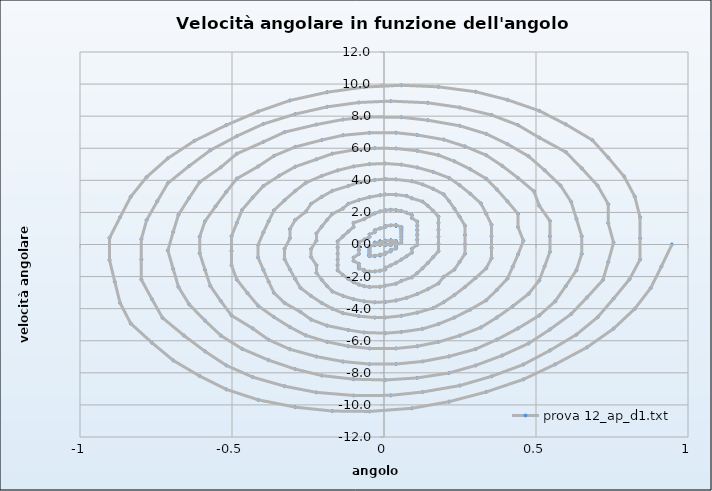
| Category | prova 12_ap_d1.txt |
|---|---|
| 0.9471016161102651 | 0 |
| 0.9121950310702651 | -1.382 |
| 0.8772884460302651 | -2.713 |
| 0.8249285684702651 | -4.007 |
| 0.7551153983912651 | -5.247 |
| 0.6678489357912651 | -6.41 |
| 0.5631291806712652 | -7.473 |
| 0.4584094255522651 | -8.409 |
| 0.3362363779122651 | -9.192 |
| 0.21406333027226512 | -9.8 |
| 0.09189028263296511 | -10.209 |
| -0.047736057526534884 | -10.406 |
| -0.16990910516573487 | -10.382 |
| -0.2920821528057349 | -10.138 |
| -0.4142552004457349 | -9.682 |
| -0.5189749555647349 | -9.029 |
| -0.6062414181647349 | -8.202 |
| -0.6935078807647349 | -7.224 |
| -0.7633210508447349 | -6.123 |
| -0.8331342209237349 | -4.923 |
| -0.8680408059637349 | -3.649 |
| -0.8854940984837348 | -2.322 |
| -0.9029473910037349 | -0.965 |
| -0.9029473910037349 | 0.406 |
| -0.8680408059637349 | 1.701 |
| -0.8331342209237349 | 2.974 |
| -0.7807743433637349 | 4.205 |
| -0.7109611732847348 | 5.374 |
| -0.6236947106847349 | 6.46 |
| -0.5189749555647349 | 7.438 |
| -0.4142552004457349 | 8.286 |
| -0.3095354453257349 | 8.977 |
| -0.1873623976857349 | 9.492 |
| -0.06518935004653488 | 9.812 |
| 0.05698369759306511 | 9.926 |
| 0.1791567452322651 | 9.829 |
| 0.30132979287226513 | 9.523 |
| 0.4060495479922651 | 9.02 |
| 0.5107693031112651 | 8.335 |
| 0.5980357657112652 | 7.49 |
| 0.6853022283112651 | 6.509 |
| 0.7376621058712651 | 5.416 |
| 0.7900219834302651 | 4.235 |
| 0.8249285684702651 | 2.989 |
| 0.8423818609902651 | 1.699 |
| 0.8423818609902651 | 0.384 |
| 0.8423818609902651 | -0.935 |
| 0.8074752759502651 | -2.172 |
| 0.7551153983912651 | -3.377 |
| 0.7027555208312651 | -4.532 |
| 0.6329423507512651 | -5.616 |
| 0.5456758881512651 | -6.607 |
| 0.4584094255522651 | -7.482 |
| 0.3536896704322651 | -8.219 |
| 0.24896991531226512 | -8.797 |
| 0.12679686767326512 | -9.196 |
| 0.02207711255316511 | -9.404 |
| -0.10009593508673488 | -9.412 |
| -0.2222689827257349 | -9.22 |
| -0.3269887378457349 | -8.834 |
| -0.4317084929657349 | -8.266 |
| -0.5189749555647349 | -7.535 |
| -0.5887881256447349 | -6.66 |
| -0.6586012957247349 | -5.665 |
| -0.7284144658047349 | -4.573 |
| -0.7633210508447349 | -3.406 |
| -0.7982276358837349 | -2.187 |
| -0.7982276358837349 | -0.934 |
| -0.7982276358837349 | 0.333 |
| -0.7807743433637349 | 1.524 |
| -0.7458677583247348 | 2.693 |
| -0.7109611732847348 | 3.821 |
| -0.6411480032047349 | 4.888 |
| -0.5713348331247349 | 5.874 |
| -0.4840683705247349 | 6.756 |
| -0.3968019079257349 | 7.515 |
| -0.2920821528057349 | 8.129 |
| -0.1873623976857349 | 8.579 |
| -0.08264264256643489 | 8.852 |
| 0.02207711255316511 | 8.939 |
| 0.14425016019326511 | 8.835 |
| 0.24896991531226512 | 8.544 |
| 0.3536896704322651 | 8.075 |
| 0.4409561330322651 | 7.442 |
| 0.5107693031112651 | 6.664 |
| 0.5980357657112652 | 5.76 |
| 0.6503956432712651 | 4.754 |
| 0.7027555208312651 | 3.666 |
| 0.7376621058712651 | 2.518 |
| 0.7376621058712651 | 1.33 |
| 0.7551153983912651 | 0.121 |
| 0.7376621058712651 | -1.089 |
| 0.7202088133512651 | -2.213 |
| 0.6678489357912651 | -3.302 |
| 0.6154890582312651 | -4.337 |
| 0.5456758881512651 | -5.298 |
| 0.4758627180712651 | -6.166 |
| 0.3885962554722651 | -6.92 |
| 0.30132979287226513 | -7.541 |
| 0.21406333027226512 | -8.011 |
| 0.10934357515326511 | -8.316 |
| 0.004623820033265111 | -8.446 |
| -0.10009593508673488 | -8.396 |
| -0.2048156902057349 | -8.168 |
| -0.2920821528057349 | -7.768 |
| -0.3793486154057349 | -7.209 |
| -0.4666150780047349 | -6.506 |
| -0.5364282480847349 | -5.679 |
| -0.5887881256447349 | -4.746 |
| -0.6411480032047349 | -3.729 |
| -0.6760545882447349 | -2.648 |
| -0.6935078807647349 | -1.523 |
| -0.7109611732847348 | -0.374 |
| -0.6935078807647349 | 0.782 |
| -0.6760545882447349 | 1.854 |
| -0.6411480032047349 | 2.897 |
| -0.6062414181647349 | 3.891 |
| -0.5364282480847349 | 4.818 |
| -0.4840683705247349 | 5.659 |
| -0.3968019079257349 | 6.394 |
| -0.3269887378457349 | 7.005 |
| -0.2222689827257349 | 7.476 |
| -0.1350025201267349 | 7.793 |
| -0.047736057526534884 | 7.947 |
| 0.05698369759306511 | 7.931 |
| 0.14425016019326511 | 7.747 |
| 0.24896991531226512 | 7.4 |
| 0.3362363779122651 | 6.899 |
| 0.4060495479922651 | 6.259 |
| 0.4758627180712651 | 5.497 |
| 0.5282225956312652 | 4.63 |
| 0.5805824731912651 | 3.679 |
| 0.6154890582312651 | 2.663 |
| 0.6329423507512651 | 1.601 |
| 0.6503956432712651 | 0.512 |
| 0.6503956432712651 | -0.586 |
| 0.6329423507512651 | -1.604 |
| 0.5980357657112652 | -2.595 |
| 0.5631291806712652 | -3.541 |
| 0.5107693031112651 | -4.424 |
| 0.4409561330322651 | -5.227 |
| 0.3711429629522651 | -5.931 |
| 0.30132979287226513 | -6.52 |
| 0.21406333027226512 | -6.977 |
| 0.12679686767326512 | -7.291 |
| 0.03953040507316511 | -7.451 |
| -0.047736057526534884 | -7.454 |
| -0.1350025201267349 | -7.297 |
| -0.2222689827257349 | -6.987 |
| -0.3095354453257349 | -6.53 |
| -0.3793486154057349 | -5.941 |
| -0.4317084929657349 | -5.234 |
| -0.5015216630447349 | -4.426 |
| -0.5364282480847349 | -3.535 |
| -0.5713348331247349 | -2.58 |
| -0.5887881256447349 | -1.579 |
| -0.6062414181647349 | -0.551 |
| -0.6062414181647349 | 0.487 |
| -0.5887881256447349 | 1.446 |
| -0.5538815406047349 | 2.381 |
| -0.5189749555647349 | 3.273 |
| -0.4840683705247349 | 4.106 |
| -0.4142552004457349 | 4.862 |
| -0.3618953228857349 | 5.526 |
| -0.2920821528057349 | 6.08 |
| -0.2048156902057349 | 6.512 |
| -0.1350025201267349 | 6.809 |
| -0.047736057526534884 | 6.963 |
| 0.03953040507316511 | 6.969 |
| 0.10934357515326511 | 6.826 |
| 0.19661003775226513 | 6.539 |
| 0.26642320783226514 | 6.116 |
| 0.3362363779122651 | 5.567 |
| 0.3885962554722651 | 4.906 |
| 0.4409561330322651 | 4.149 |
| 0.4933160105912651 | 3.314 |
| 0.5107693031112651 | 2.417 |
| 0.5456758881512651 | 1.475 |
| 0.5456758881512651 | 0.508 |
| 0.5456758881512651 | -0.469 |
| 0.5282225956312652 | -1.367 |
| 0.5107693031112651 | -2.241 |
| 0.4758627180712651 | -3.074 |
| 0.4235028405122651 | -3.85 |
| 0.3711429629522651 | -4.553 |
| 0.31878308539226513 | -5.168 |
| 0.24896991531226512 | -5.68 |
| 0.1791567452322651 | -6.076 |
| 0.10934357515326511 | -6.345 |
| 0.03953040507316511 | -6.481 |
| -0.047736057526534884 | -6.48 |
| -0.11754922760673489 | -6.34 |
| -0.1873623976857349 | -6.066 |
| -0.2571755677657349 | -5.665 |
| -0.3095354453257349 | -5.147 |
| -0.3618953228857349 | -4.526 |
| -0.4142552004457349 | -3.814 |
| -0.4491617854857349 | -3.03 |
| -0.4840683705247349 | -2.187 |
| -0.5015216630447349 | -1.304 |
| -0.5015216630447349 | -0.397 |
| -0.5015216630447349 | 0.517 |
| -0.4840683705247349 | 1.352 |
| -0.4666150780047349 | 2.162 |
| -0.4317084929657349 | 2.931 |
| -0.3968019079257349 | 3.645 |
| -0.3444420303657349 | 4.289 |
| -0.2920821528057349 | 4.848 |
| -0.2222689827257349 | 5.309 |
| -0.16990910516573487 | 5.661 |
| -0.10009593508673488 | 5.895 |
| -0.030282765006634887 | 6.004 |
| 0.03953040507316511 | 5.986 |
| 0.10934357515326511 | 5.84 |
| 0.1791567452322651 | 5.571 |
| 0.23151662279226512 | 5.185 |
| 0.28387650035226514 | 4.691 |
| 0.3362363779122651 | 4.103 |
| 0.3711429629522651 | 3.432 |
| 0.4060495479922651 | 2.694 |
| 0.4409561330322651 | 1.905 |
| 0.4409561330322651 | 1.079 |
| 0.4584094255522651 | 0.233 |
| 0.4409561330322651 | -0.617 |
| 0.4235028405122651 | -1.386 |
| 0.4060495479922651 | -2.129 |
| 0.3711429629522651 | -2.831 |
| 0.3362363779122651 | -3.478 |
| 0.28387650035226514 | -4.057 |
| 0.23151662279226512 | -4.554 |
| 0.1791567452322651 | -4.959 |
| 0.12679686767326512 | -5.261 |
| 0.05698369759306511 | -5.452 |
| 0.004623820033265111 | -5.528 |
| -0.06518935004653488 | -5.486 |
| -0.11754922760673489 | -5.328 |
| -0.1873623976857349 | -5.057 |
| -0.2397222752457349 | -4.68 |
| -0.2746288602857349 | -4.205 |
| -0.3269887378457349 | -3.645 |
| -0.3618953228857349 | -3.012 |
| -0.3793486154057349 | -2.319 |
| -0.3968019079257349 | -1.581 |
| -0.4142552004457349 | -0.812 |
| -0.4142552004457349 | -0.028 |
| -0.3968019079257349 | 0.757 |
| -0.3793486154057349 | 1.457 |
| -0.3618953228857349 | 2.129 |
| -0.3269887378457349 | 2.76 |
| -0.2920821528057349 | 3.336 |
| -0.2571755677657349 | 3.846 |
| -0.2048156902057349 | 4.277 |
| -0.15245581264573488 | 4.62 |
| -0.10009593508673488 | 4.866 |
| -0.047736057526534884 | 5.01 |
| 0.004623820033265111 | 5.048 |
| 0.05698369759306511 | 4.978 |
| 0.10934357515326511 | 4.802 |
| 0.1617034527122651 | 4.525 |
| 0.21406333027226512 | 4.153 |
| 0.24896991531226512 | 3.695 |
| 0.28387650035226514 | 3.161 |
| 0.31878308539226513 | 2.563 |
| 0.3362363779122651 | 1.914 |
| 0.3536896704322651 | 1.227 |
| 0.3536896704322651 | 0.516 |
| 0.3536896704322651 | -0.206 |
| 0.3536896704322651 | -0.853 |
| 0.3362363779122651 | -1.483 |
| 0.30132979287226513 | -2.084 |
| 0.26642320783226514 | -2.644 |
| 0.23151662279226512 | -3.151 |
| 0.19661003775226513 | -3.594 |
| 0.1617034527122651 | -3.963 |
| 0.10934357515326511 | -4.249 |
| 0.05698369759306511 | -4.446 |
| 0.004623820033265111 | -4.55 |
| -0.030282765006634887 | -4.556 |
| -0.08264264256643489 | -4.466 |
| -0.1350025201267349 | -4.28 |
| -0.16990910516573487 | -4.004 |
| -0.2048156902057349 | -3.644 |
| -0.2397222752457349 | -3.208 |
| -0.2746288602857349 | -2.707 |
| -0.2920821528057349 | -2.15 |
| -0.3095354453257349 | -1.549 |
| -0.3269887378457349 | -0.918 |
| -0.3269887378457349 | -0.268 |
| -0.3095354453257349 | 0.386 |
| -0.3095354453257349 | 0.964 |
| -0.2920821528057349 | 1.522 |
| -0.2571755677657349 | 2.049 |
| -0.2397222752457349 | 2.536 |
| -0.2048156902057349 | 2.97 |
| -0.16990910516573487 | 3.344 |
| -0.11754922760673489 | 3.648 |
| -0.08264264256643489 | 3.875 |
| -0.030282765006634887 | 4.021 |
| 0.004623820033265111 | 4.082 |
| 0.03953040507316511 | 4.055 |
| 0.09189028263296511 | 3.943 |
| 0.12679686767326512 | 3.746 |
| 0.1617034527122651 | 3.471 |
| 0.19661003775226513 | 3.122 |
| 0.21406333027226512 | 2.709 |
| 0.23151662279226512 | 2.239 |
| 0.24896991531226512 | 1.724 |
| 0.26642320783226514 | 1.173 |
| 0.26642320783226514 | 0.599 |
| 0.26642320783226514 | 0.013 |
| 0.26642320783226514 | -0.574 |
| 0.24896991531226512 | -1.079 |
| 0.23151662279226512 | -1.562 |
| 0.19661003775226513 | -2.014 |
| 0.1791567452322651 | -2.424 |
| 0.14425016019326511 | -2.784 |
| 0.10934357515326511 | -3.086 |
| 0.07443699011306511 | -3.324 |
| 0.03953040507316511 | -3.492 |
| 0.004623820033265111 | -3.585 |
| -0.030282765006634887 | -3.603 |
| -0.06518935004653488 | -3.543 |
| -0.10009593508673488 | -3.409 |
| -0.1350025201267349 | -3.202 |
| -0.16990910516573487 | -2.927 |
| -0.1873623976857349 | -2.591 |
| -0.2048156902057349 | -2.201 |
| -0.2222689827257349 | -1.765 |
| -0.2222689827257349 | -1.292 |
| -0.2397222752457349 | -0.793 |
| -0.2397222752457349 | -0.278 |
| -0.2222689827257349 | 0.243 |
| -0.2222689827257349 | 0.688 |
| -0.2048156902057349 | 1.12 |
| -0.1873623976857349 | 1.529 |
| -0.16990910516573487 | 1.906 |
| -0.1350025201267349 | 2.244 |
| -0.11754922760673489 | 2.535 |
| -0.08264264256643489 | 2.773 |
| -0.047736057526534884 | 2.953 |
| -0.01282947248663489 | 3.07 |
| 0.004623820033265111 | 3.122 |
| 0.03953040507316511 | 3.107 |
| 0.07443699011306511 | 3.026 |
| 0.09189028263296511 | 2.881 |
| 0.12679686767326512 | 2.675 |
| 0.14425016019326511 | 2.412 |
| 0.1617034527122651 | 2.099 |
| 0.1791567452322651 | 1.741 |
| 0.1791567452322651 | 1.347 |
| 0.1791567452322651 | 0.926 |
| 0.1791567452322651 | 0.485 |
| 0.1791567452322651 | 0.034 |
| 0.1791567452322651 | -0.418 |
| 0.1617034527122651 | -0.791 |
| 0.14425016019326511 | -1.148 |
| 0.12679686767326512 | -1.481 |
| 0.10934357515326511 | -1.783 |
| 0.09189028263296511 | -2.047 |
| 0.05698369759306511 | -2.269 |
| 0.03953040507316511 | -2.443 |
| 0.004623820033265111 | -2.565 |
| -0.01282947248663489 | -2.633 |
| -0.047736057526534884 | -2.645 |
| -0.06518935004653488 | -2.6 |
| -0.08264264256643489 | -2.5 |
| -0.10009593508673488 | -2.347 |
| -0.11754922760673489 | -2.144 |
| -0.1350025201267349 | -1.896 |
| -0.15245581264573488 | -1.608 |
| -0.15245581264573488 | -1.286 |
| -0.15245581264573488 | -0.937 |
| -0.15245581264573488 | -0.568 |
| -0.15245581264573488 | -0.188 |
| -0.15245581264573488 | 0.196 |
| -0.1350025201267349 | 0.506 |
| -0.11754922760673489 | 0.806 |
| -0.10009593508673488 | 1.089 |
| -0.10009593508673488 | 1.349 |
| -0.06518935004653488 | 1.581 |
| -0.047736057526534884 | 1.779 |
| -0.030282765006634887 | 1.94 |
| -0.01282947248663489 | 2.059 |
| 0.004623820033265111 | 2.136 |
| 0.02207711255316511 | 2.166 |
| 0.03953040507316511 | 2.151 |
| 0.05698369759306511 | 2.089 |
| 0.07443699011306511 | 1.984 |
| 0.09189028263296511 | 1.836 |
| 0.09189028263296511 | 1.649 |
| 0.10934357515326511 | 1.427 |
| 0.10934357515326511 | 1.175 |
| 0.10934357515326511 | 0.899 |
| 0.10934357515326511 | 0.603 |
| 0.10934357515326511 | 0.295 |
| 0.10934357515326511 | -0.02 |
| 0.09189028263296511 | -0.264 |
| 0.09189028263296511 | -0.503 |
| 0.07443699011306511 | -0.731 |
| 0.05698369759306511 | -0.943 |
| 0.03953040507316511 | -1.136 |
| 0.02207711255316511 | -1.305 |
| 0.004623820033265111 | -1.446 |
| 0.004623820033265111 | -1.556 |
| -0.01282947248663489 | -1.634 |
| -0.030282765006634887 | -1.677 |
| -0.047736057526534884 | -1.684 |
| -0.06518935004653488 | -1.655 |
| -0.06518935004653488 | -1.591 |
| -0.08264264256643489 | -1.493 |
| -0.08264264256643489 | -1.363 |
| -0.08264264256643489 | -1.205 |
| -0.10009593508673488 | -1.021 |
| -0.10009593508673488 | -0.815 |
| -0.08264264256643489 | -0.592 |
| -0.08264264256643489 | -0.356 |
| -0.08264264256643489 | -0.113 |
| -0.08264264256643489 | 0.132 |
| -0.06518935004653488 | 0.305 |
| -0.047736057526534884 | 0.471 |
| -0.047736057526534884 | 0.627 |
| -0.030282765006634887 | 0.77 |
| -0.030282765006634887 | 0.897 |
| -0.01282947248663489 | 1.005 |
| 0.004623820033265111 | 1.091 |
| 0.004623820033265111 | 1.154 |
| 0.02207711255316511 | 1.193 |
| 0.03953040507316511 | 1.206 |
| 0.03953040507316511 | 1.193 |
| 0.03953040507316511 | 1.156 |
| 0.05698369759306511 | 1.093 |
| 0.05698369759306511 | 1.007 |
| 0.05698369759306511 | 0.9 |
| 0.05698369759306511 | 0.774 |
| 0.05698369759306511 | 0.631 |
| 0.05698369759306511 | 0.475 |
| 0.05698369759306511 | 0.309 |
| 0.05698369759306511 | 0.136 |
| 0.03953040507316511 | -0.04 |
| 0.03953040507316511 | -0.144 |
| 0.03953040507316511 | -0.246 |
| 0.02207711255316511 | -0.343 |
| 0.02207711255316511 | -0.432 |
| 0.004623820033265111 | -0.512 |
| 0.004623820033265111 | -0.581 |
| -0.01282947248663489 | -0.638 |
| -0.01282947248663489 | -0.682 |
| -0.030282765006634887 | -0.71 |
| -0.030282765006634887 | -0.724 |
| -0.047736057526534884 | -0.722 |
| -0.047736057526534884 | -0.705 |
| -0.047736057526534884 | -0.673 |
| -0.047736057526534884 | -0.627 |
| -0.047736057526534884 | -0.567 |
| -0.047736057526534884 | -0.495 |
| -0.047736057526534884 | -0.413 |
| -0.047736057526534884 | -0.321 |
| -0.047736057526534884 | -0.223 |
| -0.047736057526534884 | -0.121 |
| -0.030282765006634887 | -0.015 |
| -0.030282765006634887 | 0.09 |
| -0.030282765006634887 | 0.124 |
| -0.01282947248663489 | 0.155 |
| -0.01282947248663489 | 0.183 |
| -0.01282947248663489 | 0.207 |
| 0.004623820033265111 | 0.226 |
| 0.004623820033265111 | 0.241 |
| 0.02207711255316511 | 0.251 |
| 0.02207711255316511 | 0.255 |
| 0.02207711255316511 | 0.254 |
| 0.02207711255316511 | 0.247 |
| 0.02207711255316511 | 0.235 |
| 0.03953040507316511 | 0.218 |
| 0.03953040507316511 | 0.197 |
| 0.03953040507316511 | 0.171 |
| 0.03953040507316511 | 0.142 |
| 0.02207711255316511 | 0.109 |
| 0.02207711255316511 | 0.075 |
| 0.02207711255316511 | 0.038 |
| 0.02207711255316511 | 0.001 |
| 0.02207711255316511 | -0.036 |
| 0.004623820033265111 | -0.002 |
| 0.004623820033265111 | 0.032 |
| 0.004623820033265111 | -0.005 |
| 0.004623820033265111 | 0.028 |
| -0.01282947248663489 | -0.01 |
| -0.01282947248663489 | 0.023 |
| -0.01282947248663489 | -0.015 |
| -0.01282947248663489 | 0.018 |
| -0.030282765006634887 | -0.02 |
| -0.030282765006634887 | 0.013 |
| -0.030282765006634887 | -0.025 |
| -0.030282765006634887 | 0.008 |
| -0.030282765006634887 | -0.029 |
| -0.030282765006634887 | 0.004 |
| -0.030282765006634887 | -0.033 |
| -0.030282765006634887 | 0.001 |
| -0.030282765006634887 | -0.035 |
| -0.030282765006634887 | 0 |
| -0.01282947248663489 | 0.034 |
| -0.01282947248663489 | -0.002 |
| -0.01282947248663489 | 0.032 |
| -0.01282947248663489 | -0.004 |
| -0.01282947248663489 | 0.029 |
| 0.004623820033265111 | -0.008 |
| 0.004623820033265111 | 0.025 |
| 0.004623820033265111 | -0.013 |
| 0.004623820033265111 | 0.02 |
| 0.004623820033265111 | -0.018 |
| 0.004623820033265111 | 0.015 |
| 0.004623820033265111 | -0.023 |
| 0.02207711255316511 | 0.01 |
| 0.02207711255316511 | -0.027 |
| 0.02207711255316511 | 0.006 |